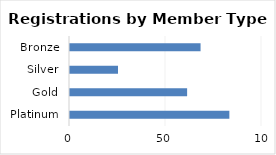
| Category | Registrations |
|---|---|
| Platinum | 83 |
| Gold | 61 |
| Silver | 25 |
| Bronze | 68 |